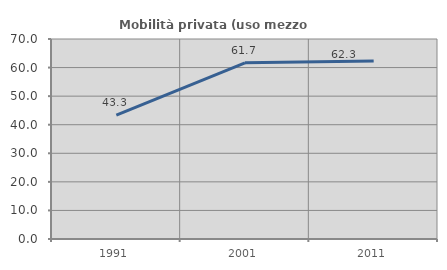
| Category | Mobilità privata (uso mezzo privato) |
|---|---|
| 1991.0 | 43.339 |
| 2001.0 | 61.679 |
| 2011.0 | 62.285 |